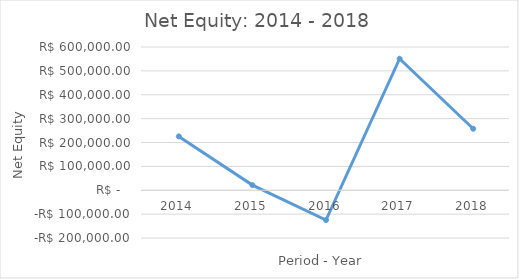
| Category | Series 0 |
|---|---|
| 2014.0 | 225636.16 |
| 2015.0 | 21693.59 |
| 2016.0 | -124899.87 |
| 2017.0 | 550873.06 |
| 2018.0 | 257577.53 |